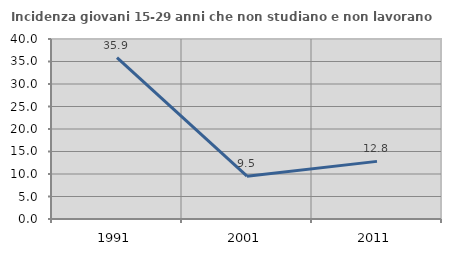
| Category | Incidenza giovani 15-29 anni che non studiano e non lavorano  |
|---|---|
| 1991.0 | 35.881 |
| 2001.0 | 9.524 |
| 2011.0 | 12.807 |